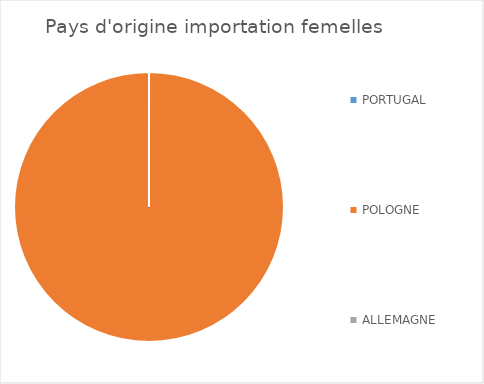
| Category | Series 0 |
|---|---|
| PORTUGAL | 0 |
| POLOGNE | 1 |
| ALLEMAGNE | 0 |